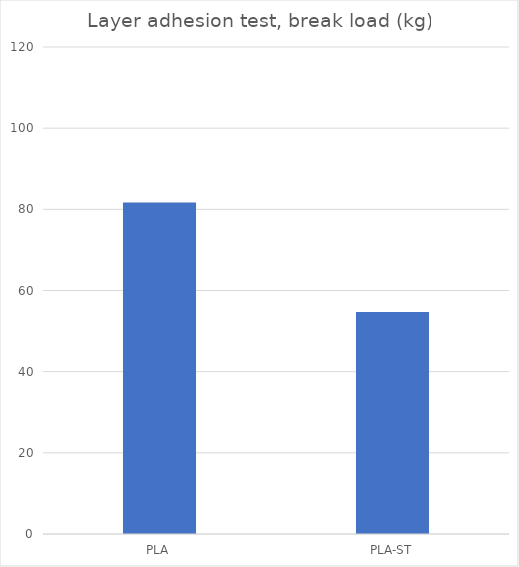
| Category | Average |
|---|---|
| PLA | 81.7 |
| PLA-ST | 54.7 |